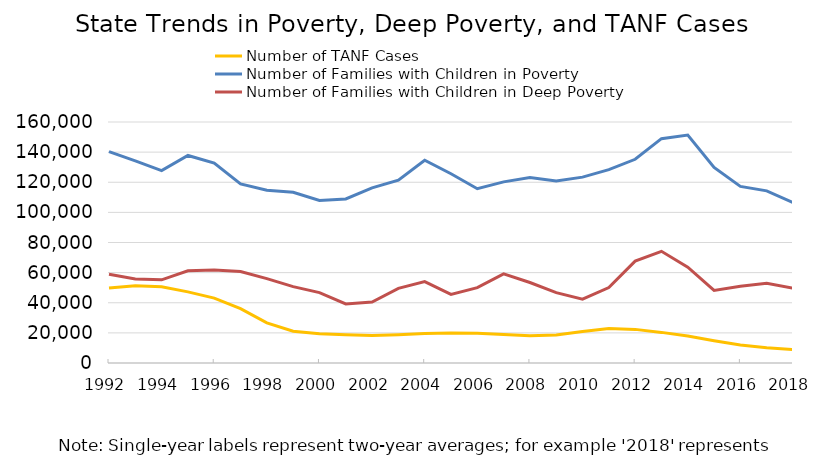
| Category | Number of TANF Cases | Number of Families with Children in Poverty | Number of Families with Children in Deep Poverty |
|---|---|---|---|
| 1992.0 | 49722.292 | 140321 | 58918 |
| 1993.0 | 51276.542 | 134165.5 | 55707 |
| 1994.0 | 50549 | 127762 | 55214 |
| 1995.0 | 47236.375 | 137794.5 | 61245.5 |
| 1996.0 | 43098.792 | 132675 | 61801.5 |
| 1997.0 | 36124.75 | 118946 | 60708.5 |
| 1998.0 | 26676.75 | 114729.5 | 56043.5 |
| 1999.0 | 21134 | 113369.5 | 50708 |
| 2000.0 | 19452.375 | 107949 | 46707 |
| 2001.0 | 18774.625 | 108883.5 | 39217.5 |
| 2002.0 | 18337.458 | 116304 | 40507.5 |
| 2003.0 | 18788.417 | 121419 | 49529 |
| 2004.0 | 19511.042 | 134615.5 | 54046 |
| 2005.0 | 19928.875 | 125638 | 45578.5 |
| 2006.0 | 19800.542 | 115679 | 50043 |
| 2007.0 | 18898 | 120260 | 59142 |
| 2008.0 | 18162.125 | 123119 | 53458 |
| 2009.0 | 18625.958 | 120864.5 | 46737.5 |
| 2010.0 | 20864.75 | 123412 | 42424 |
| 2011.0 | 22861.083 | 128381 | 50090.5 |
| 2012.0 | 22321.708 | 135242 | 67637.5 |
| 2013.0 | 20324.583 | 148935.5 | 74141.5 |
| 2014.0 | 17876.25 | 151369.5 | 63659.5 |
| 2015.0 | 14735.708 | 129819.5 | 48217.5 |
| 2016.0 | 11966 | 117267 | 51006.5 |
| 2017.0 | 10167.75 | 114289.5 | 52870 |
| 2018.0 | 8891.583 | 106562.5 | 49720.5 |